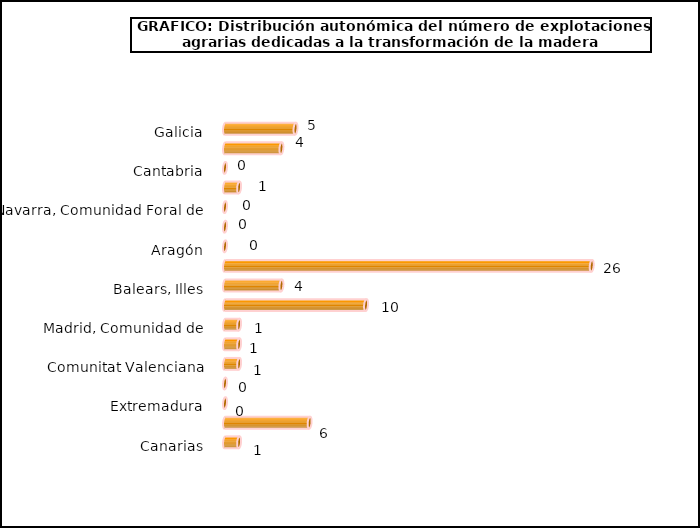
| Category | num. Explotaciones |
|---|---|
| Galicia | 5 |
| Asturias, Principado de | 4 |
| Cantabria | 0 |
| País Vasco | 1 |
| Navarra, Comunidad Foral de | 0 |
| Rioja, La | 0 |
| Aragón | 0 |
| Cataluña | 26 |
| Balears, Illes | 4 |
| Castilla y León | 10 |
| Madrid, Comunidad de | 1 |
| Castilla - La Mancha | 1 |
| Comunitat Valenciana | 1 |
| Murcia, Región de | 0 |
| Extremadura | 0 |
| Andalucía | 6 |
| Canarias | 1 |